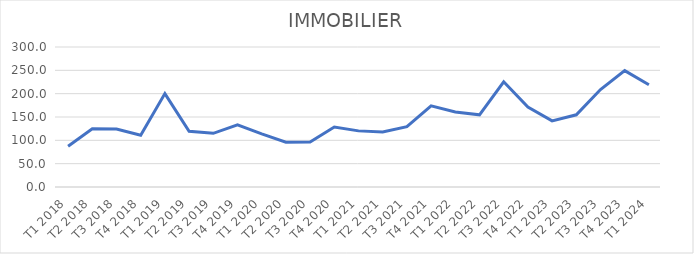
| Category | Series 0 |
|---|---|
| T1 2018 | 87.367 |
| T2 2018 | 124.963 |
| T3 2018 | 124.432 |
| T4 2018 | 110.757 |
| T1 2019 | 200.207 |
| T2 2019 | 119.423 |
| T3 2019 | 115.004 |
| T4 2019 | 133.118 |
| T1 2020 | 113.852 |
| T2 2020 | 96.068 |
| T3 2020 | 96.418 |
| T4 2020 | 128.528 |
| T1 2021 | 120.259 |
| T2 2021 | 117.761 |
| T3 2021 | 129.175 |
| T4 2021 | 173.79 |
| T1 2022 | 160.818 |
| T2 2022 | 154.729 |
| T3 2022 | 225.35 |
| T4 2022 | 171.148 |
| T1 2023 | 141.592 |
| T2 2023 | 154.729 |
| T3 2023 | 208.847 |
| T4 2023 | 249.387 |
| T1 2024 | 218.988 |